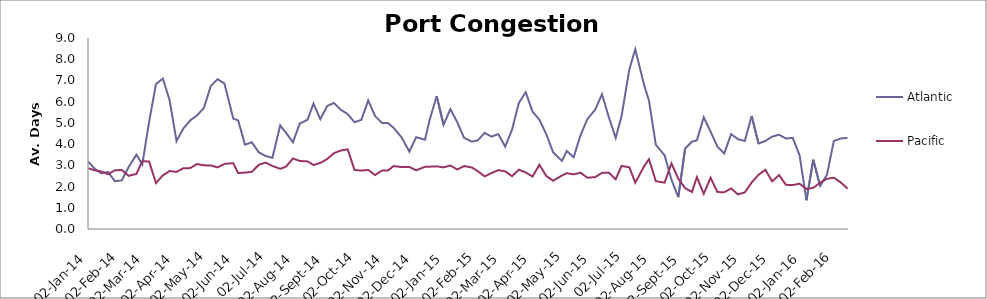
| Category | Atlantic  | Pacific |
|---|---|---|
| 2014-01-02 | 3.167 | 2.863 |
| 2014-01-08 | 2.854 | 2.767 |
| 2014-01-15 | 2.625 | 2.712 |
| 2014-01-22 | 2.688 | 2.582 |
| 2014-01-29 | 2.25 | 2.767 |
| 2014-02-05 | 2.292 | 2.781 |
| 2014-02-12 | 2.917 | 2.507 |
| 2014-02-20 | 3.5 | 2.596 |
| 2014-02-26 | 3.042 | 3.199 |
| 2014-03-05 | 5.059 | 3.178 |
| 2014-03-12 | 6.824 | 2.164 |
| 2014-03-19 | 7.088 | 2.527 |
| 2014-03-26 | 6.059 | 2.733 |
| 2014-04-02 | 4.147 | 2.692 |
| 2014-04-09 | 4.735 | 2.863 |
| 2014-04-16 | 5.118 | 2.87 |
| 2014-04-23 | 5.353 | 3.062 |
| 2014-04-30 | 5.706 | 3 |
| 2014-05-07 | 6.735 | 2.993 |
| 2014-05-14 | 7.059 | 2.904 |
| 2014-05-21 | 6.853 | 3.068 |
| 2014-05-30 | 5.206 | 3.103 |
| 2014-06-04 | 5.118 | 2.637 |
| 2014-06-11 | 3.971 | 2.658 |
| 2014-06-18 | 4.088 | 2.692 |
| 2014-06-25 | 3.618 | 3.021 |
| 2014-07-02 | 3.441 | 3.13 |
| 2014-07-09 | 3.353 | 2.973 |
| 2014-07-17 | 4.882 | 2.836 |
| 2014-07-23 | 4.529 | 2.938 |
| 2014-07-30 | 4.088 | 3.322 |
| 2014-08-06 | 4.971 | 3.205 |
| 2014-08-14 | 5.147 | 3.185 |
| 2014-08-20 | 5.912 | 3.014 |
| 2014-08-27 | 5.176 | 3.116 |
| 2014-09-03 | 5.794 | 3.295 |
| 2014-09-10 | 5.941 | 3.575 |
| 2014-09-17 | 5.618 | 3.699 |
| 2014-09-24 | 5.412 | 3.753 |
| 2014-10-01 | 5.029 | 2.781 |
| 2014-10-08 | 5.147 | 2.753 |
| 2014-10-15 | 6.059 | 2.785 |
| 2014-10-22 | 5.324 | 2.541 |
| 2014-10-29 | 5 | 2.753 |
| 2014-11-04 | 5 | 2.753 |
| 2014-11-10 | 4.765 | 2.966 |
| 2014-11-18 | 4.324 | 2.918 |
| 2014-11-26 | 3.647 | 2.925 |
| 2014-12-03 | 4.324 | 2.767 |
| 2014-12-12 | 4.206 | 2.932 |
| 2014-12-17 | 5.176 | 2.938 |
| 2014-12-24 | 6.265 | 2.952 |
| 2014-12-31 | 4.912 | 2.904 |
| 2015-01-07 | 5.647 | 2.993 |
| 2015-01-14 | 5.029 | 2.801 |
| 2015-01-21 | 4.294 | 2.966 |
| 2015-01-29 | 4.118 | 2.897 |
| 2015-02-04 | 4.176 | 2.726 |
| 2015-02-11 | 4.529 | 2.479 |
| 2015-02-18 | 4.353 | 2.637 |
| 2015-02-25 | 4.471 | 2.774 |
| 2015-03-04 | 3.882 | 2.719 |
| 2015-03-11 | 4.676 | 2.486 |
| 2015-03-18 | 5.941 | 2.795 |
| 2015-03-25 | 6.441 | 2.664 |
| 2015-04-01 | 5.529 | 2.473 |
| 2015-04-08 | 5.147 | 3.027 |
| 2015-04-15 | 4.471 | 2.5 |
| 2015-04-22 | 3.618 | 2.274 |
| 2015-05-01 | 3.206 | 2.521 |
| 2015-05-06 | 3.676 | 2.63 |
| 2015-05-13 | 3.382 | 2.575 |
| 2015-05-20 | 4.412 | 2.651 |
| 2015-05-27 | 5.176 | 2.418 |
| 2015-06-04 | 5.618 | 2.442 |
| 2015-06-11 | 6.353 | 2.645 |
| 2015-06-18 | 5.265 | 2.651 |
| 2015-06-25 | 4.294 | 2.342 |
| 2015-07-01 | 5.324 | 2.973 |
| 2015-07-09 | 7.529 | 2.904 |
| 2015-07-15 | 8.471 | 2.182 |
| 2015-07-24 | 6.794 | 2.952 |
| 2015-07-29 | 6.059 | 3.288 |
| 2015-08-05 | 3.971 | 2.253 |
| 2015-08-14 | 3.471 | 2.185 |
| 2015-08-21 | 2.324 | 3.089 |
| 2015-08-28 | 1.5 | 2.37 |
| 2015-09-04 | 3.794 | 1.925 |
| 2015-09-11 | 4.118 | 1.747 |
| 2015-09-16 | 4.176 | 2.445 |
| 2015-09-23 | 5.265 | 1.658 |
| 2015-09-30 | 4.588 | 2.418 |
| 2015-10-07 | 3.882 | 1.74 |
| 2015-10-14 | 3.559 | 1.733 |
| 2015-10-21 | 4.471 | 1.911 |
| 2015-10-28 | 4.235 | 1.63 |
| 2015-11-04 | 4.147 | 1.726 |
| 2015-11-11 | 5.324 | 2.192 |
| 2015-11-18 | 4.029 | 2.555 |
| 2015-11-25 | 4.147 | 2.788 |
| 2015-12-02 | 4.353 | 2.247 |
| 2015-12-09 | 4.441 | 2.541 |
| 2015-12-16 | 4.265 | 2.082 |
| 2015-12-23 | 4.294 | 2.068 |
| 2015-12-30 | 3.471 | 2.137 |
| 2016-01-06 | 1.353 | 1.884 |
| 2016-01-13 | 3.265 | 1.938 |
| 2016-01-20 | 2.029 | 2.185 |
| 2016-01-27 | 2.559 | 2.363 |
| 2016-02-03 | 4.147 | 2.418 |
| 2016-02-10 | 4.265 | 2.199 |
| 2016-02-17 | 4.294 | 1.904 |